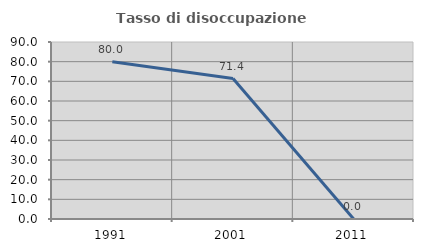
| Category | Tasso di disoccupazione giovanile  |
|---|---|
| 1991.0 | 80 |
| 2001.0 | 71.429 |
| 2011.0 | 0 |